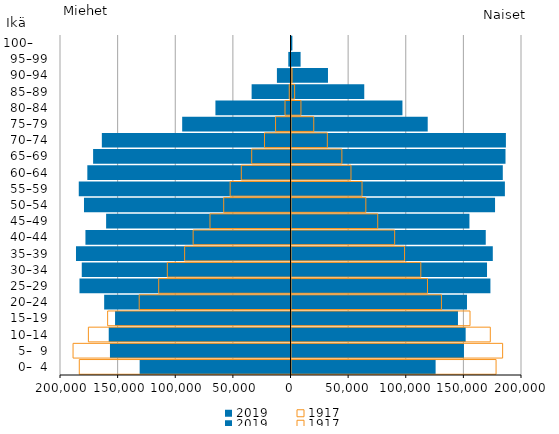
| Category | 2019 | 1917 |
|---|---|---|
|   0–  4 | 125040 | 177500 |
|   5–  9 | 149633 | 183200 |
| 10–14 | 151113 | 172500 |
| 15–19 | 144441 | 154900 |
| 20–24 | 152265 | 130100 |
| 25–29 | 172593 | 118000 |
| 30–34 | 169653 | 112200 |
| 35–39 | 174660 | 98100 |
| 40–44 | 168547 | 89500 |
| 45–49 | 154391 | 74800 |
| 50–54 | 176612 | 64500 |
| 55–59 | 185152 | 61200 |
| 60–64 | 183336 | 51600 |
| 65–69 | 185685 | 43700 |
| 70–74 | 186034 | 31100 |
| 75–79 | 118190 | 19300 |
| 80–84 | 96256 | 8200 |
| 85–89 | 63133 | 2700 |
| 90–94 | 31652 | 500 |
| 95–99 | 7888 | 0 |
| 100–     | 756 | 0 |